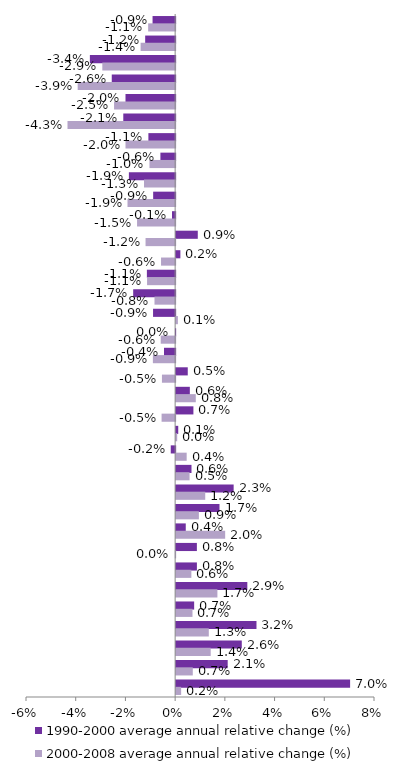
| Category | 1990-2000 average annual relative change (%) | 2000-2008 average annual relative change (%) |
|---|---|---|
| EU-27 | -0.009 | -0.011 |
| EU-15 | -0.012 | -0.014 |
| United Kingdom | -0.034 | -0.029 |
| Germany | -0.026 | -0.039 |
| Netherlands | -0.02 | -0.025 |
| Belgium | -0.021 | -0.043 |
| Finland | -0.011 | -0.02 |
| Bulgaria | -0.006 | -0.01 |
| Austria | -0.019 | -0.013 |
| Sweden | -0.009 | -0.019 |
| Greece | -0.001 | -0.015 |
| Italy | 0.009 | -0.012 |
| Poland | 0.002 | -0.006 |
| Norway | -0.011 | -0.011 |
| Switzerland | -0.017 | -0.008 |
| Lithuania | -0.009 | 0.001 |
| Estonia | 0 | -0.006 |
| Luxembourg | -0.004 | -0.009 |
| Ireland | 0.005 | -0.005 |
| Liechtenstein | 0.006 | 0.008 |
| Slovenia | 0.007 | -0.005 |
| Denmark | 0.001 | 0 |
| Latvia | -0.002 | 0.004 |
| Iceland | 0.006 | 0.005 |
| Malta | 0.023 | 0.012 |
| Cyprus | 0.017 | 0.009 |
| Croatia | 0.004 | 0.02 |
| Hungary | 0.008 | 0 |
| Czech Republic | 0.008 | 0.006 |
| Slovakia | 0.029 | 0.017 |
| Portugal | 0.007 | 0.007 |
| Romania | 0.032 | 0.013 |
| Spain | 0.026 | 0.014 |
| France | 0.021 | 0.007 |
| Turkey | 0.07 | 0.002 |